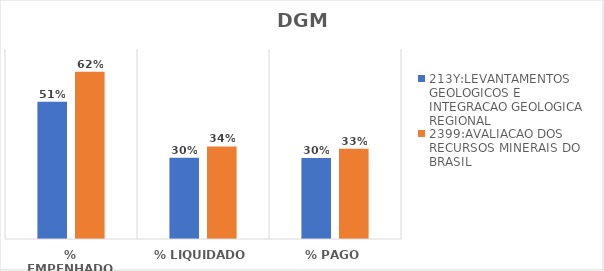
| Category | 213Y:LEVANTAMENTOS GEOLOGICOS E INTEGRACAO GEOLOGICA REGIONAL | 2399:AVALIACAO DOS RECURSOS MINERAIS DO BRASIL |
|---|---|---|
| % EMPENHADO | 0.506 | 0.617 |
| % LIQUIDADO | 0.3 | 0.341 |
| % PAGO | 0.298 | 0.332 |